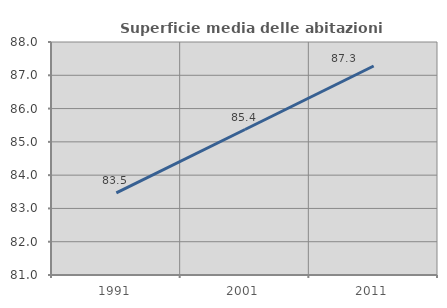
| Category | Superficie media delle abitazioni occupate |
|---|---|
| 1991.0 | 83.47 |
| 2001.0 | 85.371 |
| 2011.0 | 87.279 |